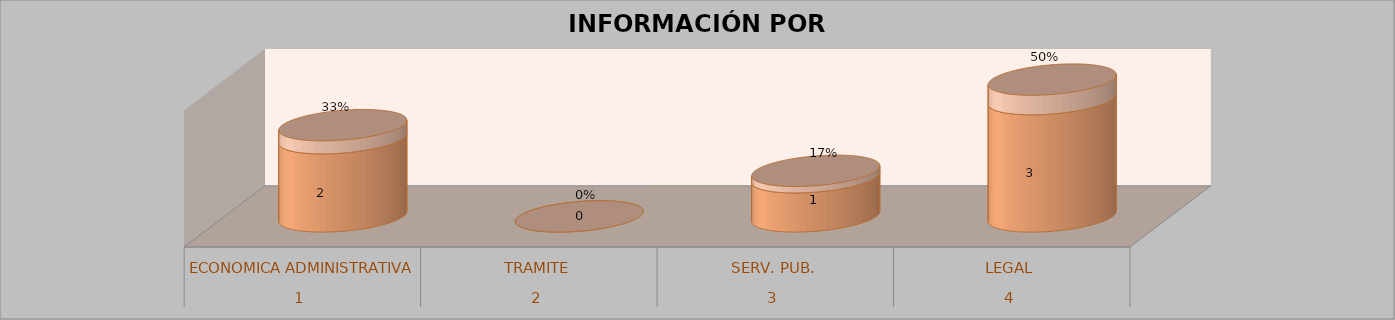
| Category | Series 0 | Series 1 | Series 2 | Series 3 |
|---|---|---|---|---|
| 0 |  |  | 2 | 0.333 |
| 1 |  |  | 0 | 0 |
| 2 |  |  | 1 | 0.167 |
| 3 |  |  | 3 | 0.5 |